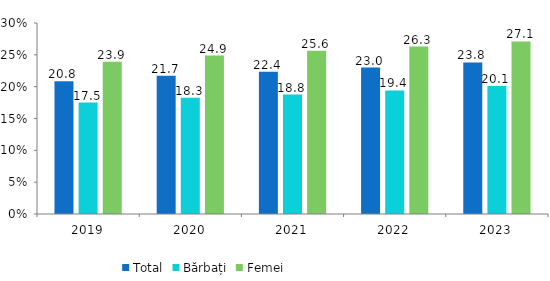
| Category | Total | Bărbați | Femei |
|---|---|---|---|
| 2019.0 | 20.841 | 17.498 | 23.897 |
| 2020.0 | 21.723 | 18.263 | 24.885 |
| 2021.0 | 22.355 | 18.756 | 25.638 |
| 2022.0 | 23 | 19.4 | 26.3 |
| 2023.0 | 23.8 | 20.1 | 27.1 |